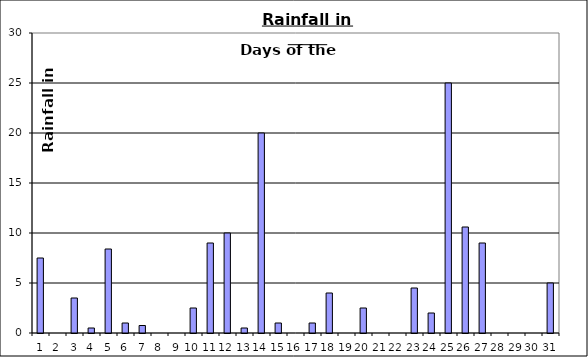
| Category | Series 0 |
|---|---|
| 0 | 7.5 |
| 1 | 0 |
| 2 | 3.5 |
| 3 | 0.5 |
| 4 | 8.4 |
| 5 | 1 |
| 6 | 0.75 |
| 7 | 0 |
| 8 | 0 |
| 9 | 2.5 |
| 10 | 9 |
| 11 | 10 |
| 12 | 0.5 |
| 13 | 20 |
| 14 | 1 |
| 15 | 0 |
| 16 | 1 |
| 17 | 4 |
| 18 | 0 |
| 19 | 2.5 |
| 20 | 0 |
| 21 | 0 |
| 22 | 4.5 |
| 23 | 2 |
| 24 | 25 |
| 25 | 10.6 |
| 26 | 9 |
| 27 | 0 |
| 28 | 0 |
| 29 | 0 |
| 30 | 5 |